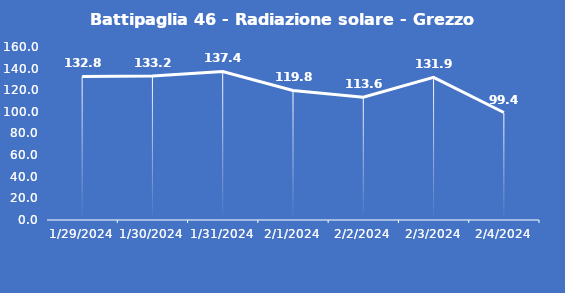
| Category | Battipaglia 46 - Radiazione solare - Grezzo (W/m2) |
|---|---|
| 1/29/24 | 132.8 |
| 1/30/24 | 133.2 |
| 1/31/24 | 137.4 |
| 2/1/24 | 119.8 |
| 2/2/24 | 113.6 |
| 2/3/24 | 131.9 |
| 2/4/24 | 99.4 |